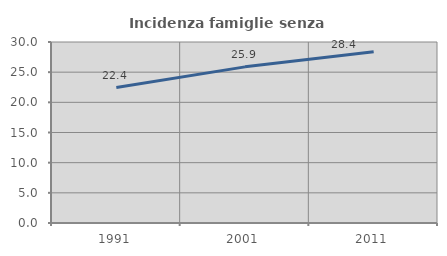
| Category | Incidenza famiglie senza nuclei |
|---|---|
| 1991.0 | 22.449 |
| 2001.0 | 25.879 |
| 2011.0 | 28.398 |